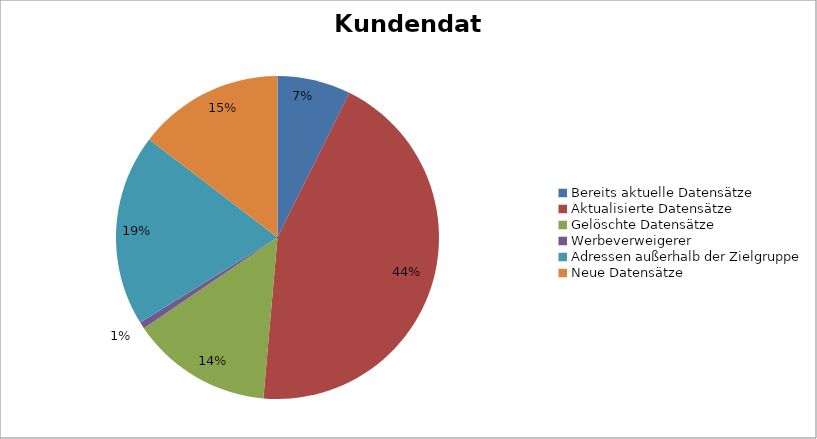
| Category | Series 0 |
|---|---|
| Bereits aktuelle Datensätze | 2511 |
| Aktualisierte Datensätze | 15077 |
| Gelöschte Datensätze | 4833 |
| Werbeverweigerer | 224 |
| Adressen außerhalb der Zielgruppe | 6577 |
| Neue Datensätze | 5000 |